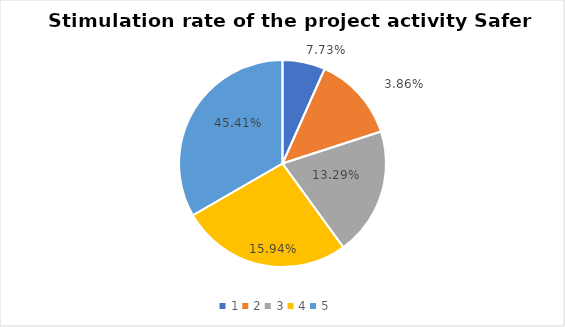
| Category | Series 0 | Series 1 |
|---|---|---|
| 0 | 1 | 0.077 |
| 1 | 2 | 0.039 |
| 2 | 3 | 0.133 |
| 3 | 4 | 0.159 |
| 4 | 5 | 0.454 |